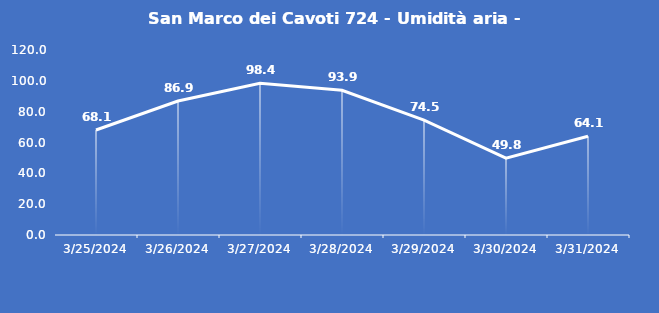
| Category | San Marco dei Cavoti 724 - Umidità aria - Grezzo (%) |
|---|---|
| 3/25/24 | 68.1 |
| 3/26/24 | 86.9 |
| 3/27/24 | 98.4 |
| 3/28/24 | 93.9 |
| 3/29/24 | 74.5 |
| 3/30/24 | 49.8 |
| 3/31/24 | 64.1 |